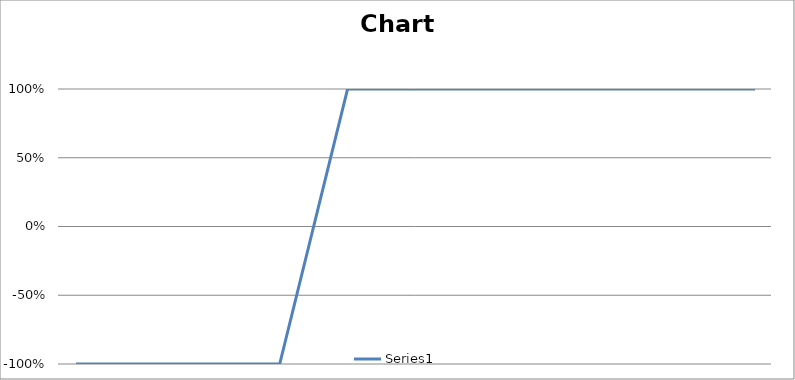
| Category | Series 0 |
|---|---|
| 0 | -35 |
| 1 | -30 |
| 2 | -25 |
| 3 | -20 |
| 4 | -15 |
| 5 | -10 |
| 6 | -5 |
| 7 | 0 |
| 8 | 5 |
| 9 | 10 |
| 10 | 15 |
| 11 | 20 |
| 12 | 25 |
| 13 | 30 |
| 14 | 35 |
| 15 | 40 |
| 16 | 45 |
| 17 | 50 |
| 18 | 55 |
| 19 | 60 |
| 20 | 65 |